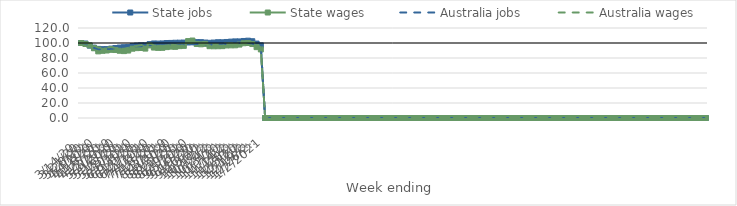
| Category | State jobs | State wages | Australia jobs | Australia wages |
|---|---|---|---|---|
| 14/03/2020 | 100 | 100 | 100 | 100 |
| 21/03/2020 | 99.324 | 98.651 | 99.218 | 99.669 |
| 28/03/2020 | 96.507 | 96.837 | 96.159 | 98.38 |
| 04/04/2020 | 93.826 | 92.966 | 93.511 | 96.663 |
| 11/04/2020 | 92.165 | 88.844 | 91.845 | 94.08 |
| 18/04/2020 | 91.802 | 89.565 | 91.454 | 93.993 |
| 25/04/2020 | 91.856 | 89.99 | 91.82 | 94.131 |
| 02/05/2020 | 92.534 | 90.875 | 92.24 | 94.625 |
| 09/05/2020 | 93.267 | 90.627 | 92.814 | 93.438 |
| 16/05/2020 | 93.933 | 89.664 | 93.355 | 92.628 |
| 23/05/2020 | 94.407 | 89.188 | 93.675 | 92.257 |
| 30/05/2020 | 94.764 | 89.928 | 94.182 | 93.555 |
| 06/06/2020 | 95.782 | 92.413 | 95.129 | 95.487 |
| 13/06/2020 | 96.579 | 93.156 | 95.64 | 96.179 |
| 20/06/2020 | 96.908 | 93.318 | 95.803 | 97.167 |
| 27/06/2020 | 96.837 | 92.539 | 95.768 | 97.377 |
| 04/07/2020 | 98.536 | 96.742 | 97.026 | 99.465 |
| 11/07/2020 | 99.393 | 93.909 | 97.722 | 96.839 |
| 18/07/2020 | 99.211 | 93.499 | 97.64 | 96.355 |
| 25/07/2020 | 99.431 | 93.581 | 97.768 | 96.035 |
| 01/08/2020 | 99.968 | 94.524 | 97.912 | 96.762 |
| 08/08/2020 | 100.094 | 95.148 | 97.848 | 97.159 |
| 15/08/2020 | 100.322 | 94.873 | 97.715 | 96.636 |
| 22/08/2020 | 100.405 | 95.847 | 97.726 | 96.439 |
| 29/08/2020 | 100.598 | 96.175 | 97.792 | 96.622 |
| 05/09/2020 | 100.652 | 102.56 | 97.988 | 99.323 |
| 12/09/2020 | 101.087 | 103.289 | 98.415 | 100.272 |
| 19/09/2020 | 101.167 | 98.71 | 98.579 | 101.043 |
| 26/09/2020 | 101.116 | 98.252 | 98.452 | 100.421 |
| 03/10/2020 | 100.608 | 98.786 | 97.813 | 98.297 |
| 10/10/2020 | 100.238 | 95.759 | 97.688 | 96.578 |
| 17/10/2020 | 100.585 | 95.62 | 98.252 | 97.02 |
| 24/10/2020 | 101.01 | 95.7 | 98.419 | 96.422 |
| 31/10/2020 | 100.934 | 95.819 | 98.499 | 96.422 |
| 07/11/2020 | 101.365 | 96.738 | 98.826 | 97.695 |
| 14/11/2020 | 101.823 | 96.874 | 99.425 | 98.506 |
| 21/11/2020 | 102.119 | 96.899 | 99.648 | 98.519 |
| 28/11/2020 | 102.101 | 97.887 | 99.873 | 99.566 |
| 05/12/2020 | 102.705 | 99.674 | 100.204 | 100.773 |
| 12/12/2020 | 103.085 | 100.013 | 100.228 | 101.122 |
| 19/12/2020 | 102.36 | 98.613 | 99.39 | 101.653 |
| 26/12/2020 | 99.244 | 94.476 | 96.352 | 97.474 |
| 02/01/2021 | 96.898 | 91.422 | 93.927 | 93.755 |